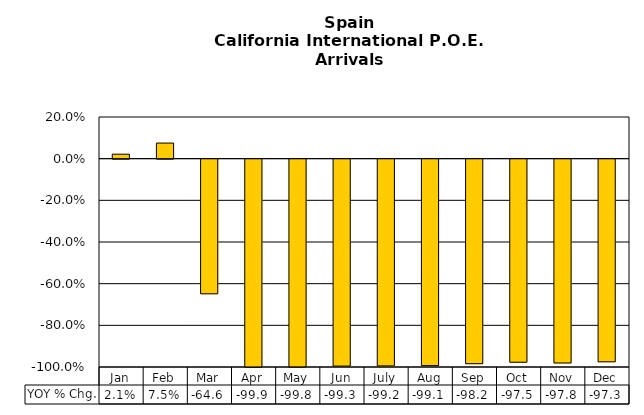
| Category | YOY % Chg. |
|---|---|
| Jan | 0.021 |
| Feb | 0.075 |
| Mar | -0.646 |
| Apr | -0.999 |
| May | -0.998 |
| Jun | -0.993 |
| July | -0.992 |
| Aug | -0.991 |
| Sep | -0.982 |
| Oct | -0.975 |
| Nov | -0.978 |
| Dec | -0.973 |